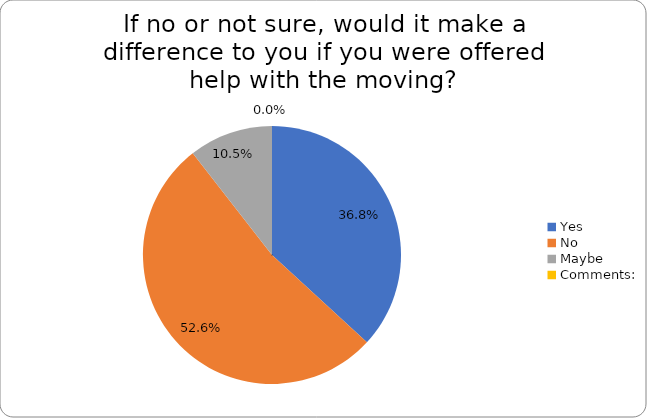
| Category | Series 0 |
|---|---|
| Yes | 0.368 |
| No | 0.526 |
| Maybe | 0.105 |
| Comments: | 0 |